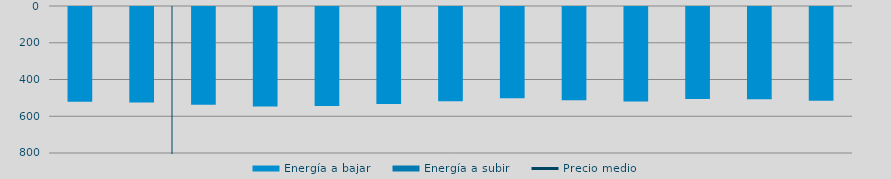
| Category | Energía a bajar | Energía a subir |
|---|---|---|
| 0 | 515.549 |  |
| 1 | 519.921 |  |
| 2 | 531.331 |  |
| 3 | 542.024 |  |
| 4 | 539.136 |  |
| 5 | 527.758 |  |
| 6 | 513.52 |  |
| 7 | 497.172 |  |
| 8 | 507.87 |  |
| 9 | 514.171 |  |
| 10 | 501.31 |  |
| 11 | 501.713 |  |
| 12 | 510.776 |  |